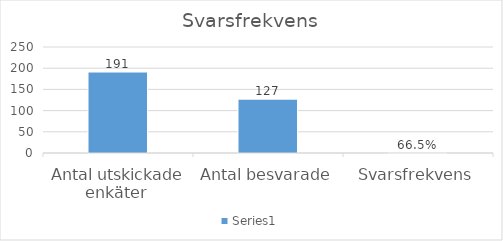
| Category | Series 0 |
|---|---|
| Antal utskickade enkäter  | 191 |
| Antal besvarade | 127 |
| Svarsfrekvens | 0.665 |